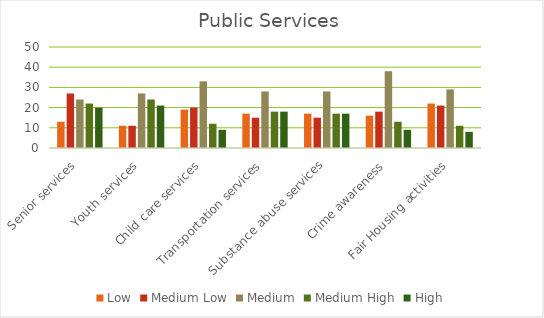
| Category | Low | Medium Low | Medium | Medium High | High |
|---|---|---|---|---|---|
| Senior services | 13 | 27 | 24 | 22 | 20 |
| Youth services | 11 | 11 | 27 | 24 | 21 |
| Child care services | 19 | 20 | 33 | 12 | 9 |
| Transportation services | 17 | 15 | 28 | 18 | 18 |
| Substance abuse services | 17 | 15 | 28 | 17 | 17 |
| Crime awareness | 16 | 18 | 38 | 13 | 9 |
| Fair Housing activities | 22 | 21 | 29 | 11 | 8 |